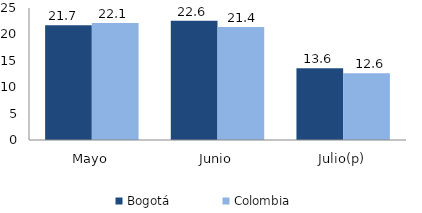
| Category | Bogotá | Colombia |
|---|---|---|
| Mayo | 21.721 | 22.142 |
| Junio | 22.599 | 21.386 |
| Julio(p) | 13.604 | 12.637 |